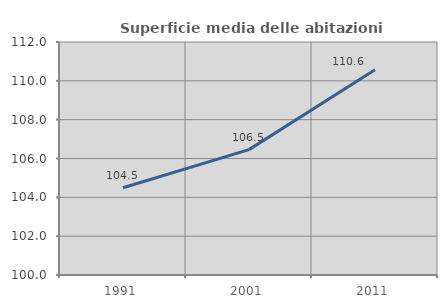
| Category | Superficie media delle abitazioni occupate |
|---|---|
| 1991.0 | 104.491 |
| 2001.0 | 106.456 |
| 2011.0 | 110.567 |